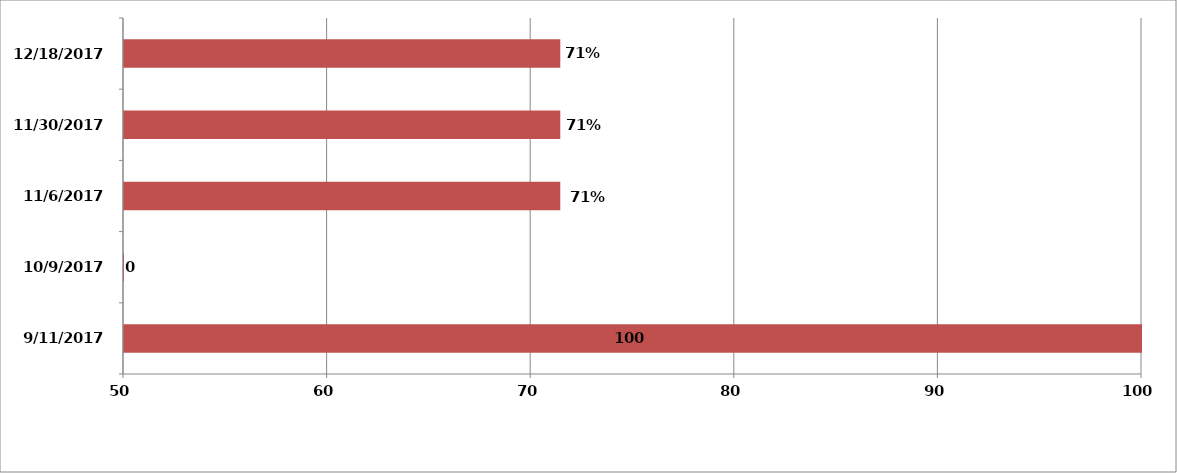
| Category | Series 1 |
|---|---|
| 11/09/2017 | 100 |
| 09/10/2017 | 0 |
| 06/11/2017 | 71.429 |
| 30/11/2017 | 71.429 |
| 18/12/2017 | 71.429 |